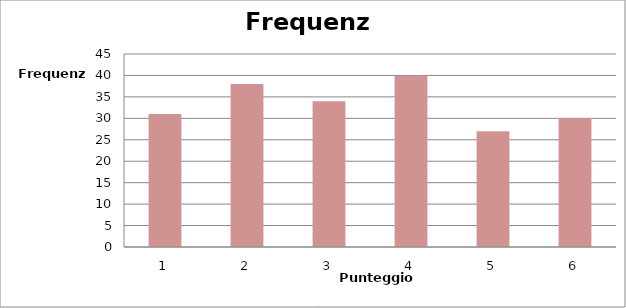
| Category | Frequenza |
|---|---|
| 1.0 | 31 |
| 2.0 | 38 |
| 3.0 | 34 |
| 4.0 | 40 |
| 5.0 | 27 |
| 6.0 | 30 |